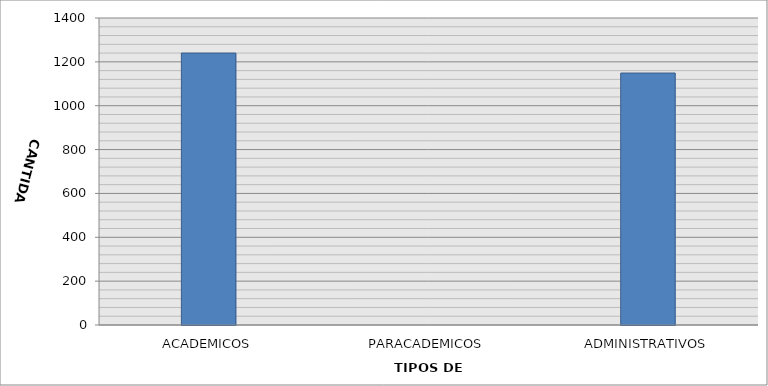
| Category | CANTIDAD |
|---|---|
| ACADEMICOS | 1240 |
| PARACADEMICOS | 0 |
| ADMINISTRATIVOS | 1149 |